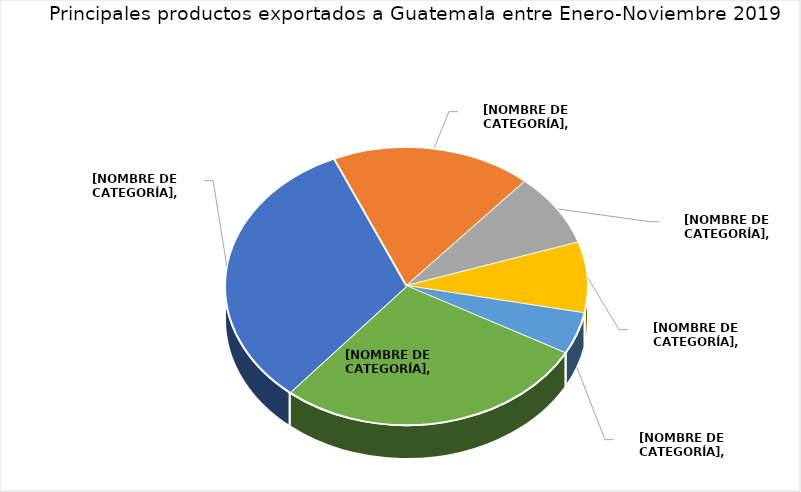
| Category | Series 0 |
|---|---|
| Los demás papeles y cartones kraft, de peso superior o igual a 225 g/m2, sin estucar ni recubrir. | 0.323 |
| Envases para cervezas o bebidas gasificadas, de capacidad inferior o igual a 300 l, de aluminio. | 0.179 |
| Carne de animales de la especie bovina, deshuesada, fresca o refrigerada. | 0.085 |
| Papel higiénico de pasta de papel. | 0.082 |
| Carne de animales de la especie bovina, deshuesada, congelada. | 0.049 |
| 49 Productos restantes | 0.281 |